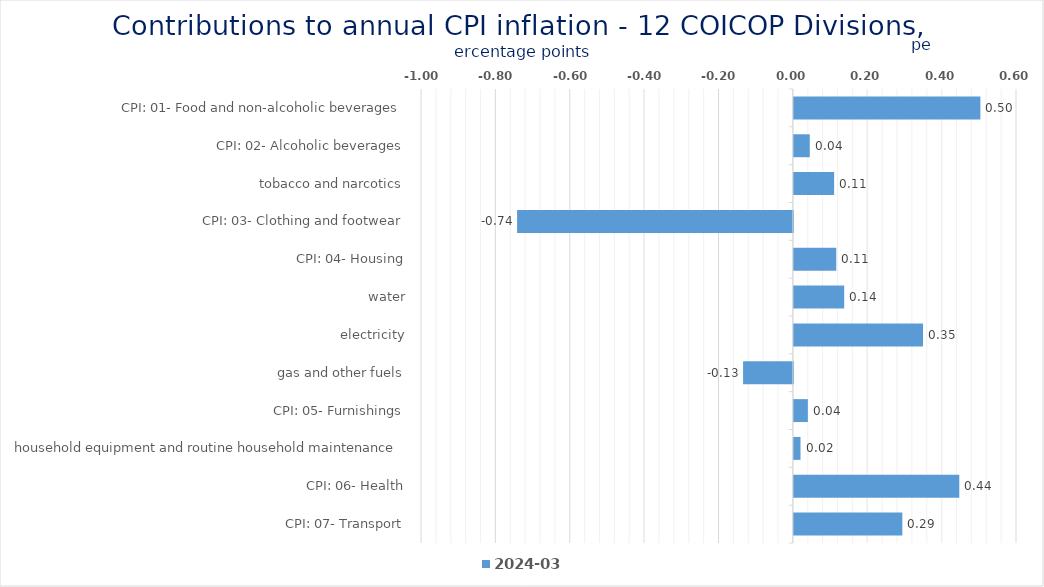
| Category | 2024-03 |
|---|---|
| CPI: 01- Food and non-alcoholic beverages | 0.502 |
| CPI: 02- Alcoholic beverages, tobacco and narcotics | 0.043 |
| CPI: 03- Clothing and footwear | 0.108 |
| CPI: 04- Housing, water, electricity, gas and other fuels | -0.742 |
| CPI: 05- Furnishings, household equipment and routine household maintenance | 0.114 |
| CPI: 06- Health | 0.135 |
| CPI: 07- Transport | 0.347 |
| CPI: 08- Communication | -0.134 |
| CPI: 09- Recreation and culture | 0.038 |
| CPI: 10- Education | 0.018 |
| CPI: 11- Restaurants and hotels | 0.445 |
| CPI: 12- Miscellaneous goods and services | 0.292 |